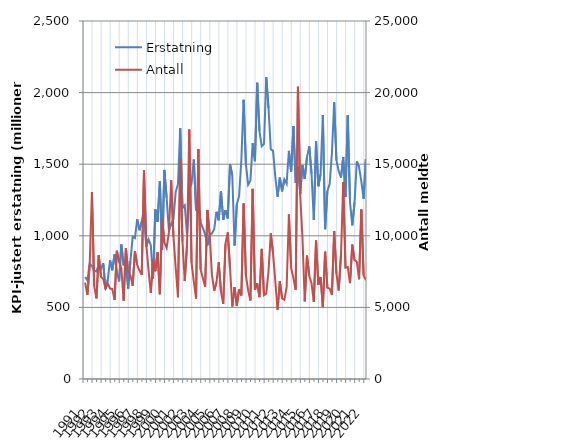
| Category | Erstatning |
|---|---|
| 1991.0 | 712.091 |
| nan | 688.87 |
| nan | 803.774 |
| nan | 790.113 |
| 1992.0 | 755.999 |
| nan | 751.171 |
| nan | 802.046 |
| nan | 769.885 |
| 1993.0 | 808.411 |
| nan | 627.829 |
| nan | 692.689 |
| nan | 828.993 |
| 1994.0 | 759.053 |
| nan | 870.757 |
| nan | 746.304 |
| nan | 681.392 |
| 1995.0 | 939.136 |
| nan | 793.787 |
| nan | 837.562 |
| nan | 631.639 |
| 1996.0 | 822.954 |
| nan | 994.2 |
| nan | 984.284 |
| nan | 1116.846 |
| 1997.0 | 1038.793 |
| nan | 1098.527 |
| nan | 1190.953 |
| nan | 925.89 |
| 1998.0 | 975.412 |
| nan | 934.719 |
| nan | 700.539 |
| nan | 1184.828 |
| 1999.0 | 1097.792 |
| nan | 1382.401 |
| nan | 900.612 |
| nan | 1460.088 |
| 2000.0 | 1266.207 |
| nan | 1036.243 |
| nan | 1083.365 |
| nan | 1118.063 |
| 2001.0 | 1306.911 |
| nan | 1360.4 |
| nan | 1751.667 |
| nan | 1193.779 |
| 2002.0 | 1212.498 |
| nan | 1011.964 |
| nan | 1320.458 |
| nan | 1365.799 |
| 2003.0 | 1532.5 |
| nan | 1176.367 |
| nan | 1241.781 |
| nan | 1093.612 |
| 2004.0 | 1054.733 |
| nan | 1008.974 |
| nan | 933.063 |
| nan | 1005.222 |
| 2005.0 | 1016.114 |
| nan | 1045.372 |
| nan | 1167.82 |
| nan | 1108.209 |
| 2006.0 | 1312.257 |
| nan | 1111.449 |
| nan | 1178.693 |
| nan | 1121.266 |
| 2007.0 | 1501.55 |
| nan | 1422.439 |
| nan | 931.931 |
| nan | 1219.16 |
| 2008.0 | 1276.935 |
| nan | 1527.729 |
| nan | 1950.664 |
| nan | 1502.682 |
| 2009.0 | 1356.793 |
| nan | 1385.22 |
| nan | 1646.429 |
| nan | 1521.216 |
| 2010.0 | 2069.122 |
| nan | 1731.556 |
| nan | 1625.748 |
| nan | 1641.43 |
| 2011.0 | 2107.567 |
| nan | 1890.862 |
| nan | 1604.647 |
| nan | 1592.932 |
| 2012.0 | 1410.933 |
| nan | 1272.923 |
| nan | 1406.702 |
| nan | 1310.678 |
| 2013.0 | 1394.554 |
| nan | 1363.642 |
| nan | 1592.981 |
| nan | 1447.831 |
| 2014.0 | 1766.353 |
| nan | 1369.315 |
| nan | 1485.533 |
| nan | 1296.583 |
| 2015.0 | 1493.805 |
| nan | 1396.382 |
| nan | 1550.751 |
| nan | 1624.888 |
| 2016.0 | 1434.461 |
| nan | 1109.967 |
| nan | 1659.246 |
| nan | 1345.729 |
| 2017.0 | 1430.505 |
| nan | 1843.136 |
| nan | 1046.216 |
| nan | 1311.683 |
| 2018.0 | 1361.799 |
| nan | 1576.783 |
| nan | 1932.999 |
| nan | 1527.127 |
| 2019.0 | 1451.332 |
| nan | 1407.183 |
| nan | 1550.621 |
| nan | 1270.512 |
| 2020.0 | 1842.023 |
| nan | 1233.821 |
| nan | 1072.713 |
| nan | 1233.742 |
| 2021.0 | 1520.859 |
| nan | 1479.793 |
| nan | 1378.373 |
| nan | 1258.761 |
| 2022.0 | 1535.742 |